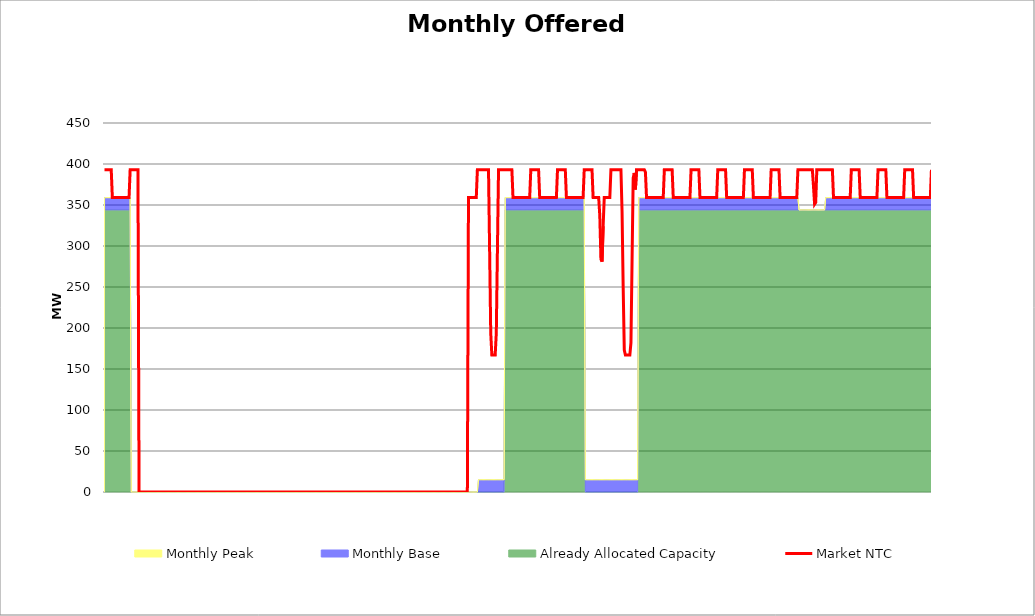
| Category | Market NTC |
|---|---|
| 0 | 393 |
| 1 | 393 |
| 2 | 393 |
| 3 | 393 |
| 4 | 393 |
| 5 | 393 |
| 6 | 393 |
| 7 | 359 |
| 8 | 359 |
| 9 | 359 |
| 10 | 359 |
| 11 | 359 |
| 12 | 359 |
| 13 | 359 |
| 14 | 359 |
| 15 | 359 |
| 16 | 359 |
| 17 | 359 |
| 18 | 359 |
| 19 | 359 |
| 20 | 359 |
| 21 | 359 |
| 22 | 359 |
| 23 | 393 |
| 24 | 393 |
| 25 | 393 |
| 26 | 393 |
| 27 | 393 |
| 28 | 393 |
| 29 | 393 |
| 30 | 393 |
| 31 | 0 |
| 32 | 0 |
| 33 | 0 |
| 34 | 0 |
| 35 | 0 |
| 36 | 0 |
| 37 | 0 |
| 38 | 0 |
| 39 | 0 |
| 40 | 0 |
| 41 | 0 |
| 42 | 0 |
| 43 | 0 |
| 44 | 0 |
| 45 | 0 |
| 46 | 0 |
| 47 | 0 |
| 48 | 0 |
| 49 | 0 |
| 50 | 0 |
| 51 | 0 |
| 52 | 0 |
| 53 | 0 |
| 54 | 0 |
| 55 | 0 |
| 56 | 0 |
| 57 | 0 |
| 58 | 0 |
| 59 | 0 |
| 60 | 0 |
| 61 | 0 |
| 62 | 0 |
| 63 | 0 |
| 64 | 0 |
| 65 | 0 |
| 66 | 0 |
| 67 | 0 |
| 68 | 0 |
| 69 | 0 |
| 70 | 0 |
| 71 | 0 |
| 72 | 0 |
| 73 | 0 |
| 74 | 0 |
| 75 | 0 |
| 76 | 0 |
| 77 | 0 |
| 78 | 0 |
| 79 | 0 |
| 80 | 0 |
| 81 | 0 |
| 82 | 0 |
| 83 | 0 |
| 84 | 0 |
| 85 | 0 |
| 86 | 0 |
| 87 | 0 |
| 88 | 0 |
| 89 | 0 |
| 90 | 0 |
| 91 | 0 |
| 92 | 0 |
| 93 | 0 |
| 94 | 0 |
| 95 | 0 |
| 96 | 0 |
| 97 | 0 |
| 98 | 0 |
| 99 | 0 |
| 100 | 0 |
| 101 | 0 |
| 102 | 0 |
| 103 | 0 |
| 104 | 0 |
| 105 | 0 |
| 106 | 0 |
| 107 | 0 |
| 108 | 0 |
| 109 | 0 |
| 110 | 0 |
| 111 | 0 |
| 112 | 0 |
| 113 | 0 |
| 114 | 0 |
| 115 | 0 |
| 116 | 0 |
| 117 | 0 |
| 118 | 0 |
| 119 | 0 |
| 120 | 0 |
| 121 | 0 |
| 122 | 0 |
| 123 | 0 |
| 124 | 0 |
| 125 | 0 |
| 126 | 0 |
| 127 | 0 |
| 128 | 0 |
| 129 | 0 |
| 130 | 0 |
| 131 | 0 |
| 132 | 0 |
| 133 | 0 |
| 134 | 0 |
| 135 | 0 |
| 136 | 0 |
| 137 | 0 |
| 138 | 0 |
| 139 | 0 |
| 140 | 0 |
| 141 | 0 |
| 142 | 0 |
| 143 | 0 |
| 144 | 0 |
| 145 | 0 |
| 146 | 0 |
| 147 | 0 |
| 148 | 0 |
| 149 | 0 |
| 150 | 0 |
| 151 | 0 |
| 152 | 0 |
| 153 | 0 |
| 154 | 0 |
| 155 | 0 |
| 156 | 0 |
| 157 | 0 |
| 158 | 0 |
| 159 | 0 |
| 160 | 0 |
| 161 | 0 |
| 162 | 0 |
| 163 | 0 |
| 164 | 0 |
| 165 | 0 |
| 166 | 0 |
| 167 | 0 |
| 168 | 0 |
| 169 | 0 |
| 170 | 0 |
| 171 | 0 |
| 172 | 0 |
| 173 | 0 |
| 174 | 0 |
| 175 | 0 |
| 176 | 0 |
| 177 | 0 |
| 178 | 0 |
| 179 | 0 |
| 180 | 0 |
| 181 | 0 |
| 182 | 0 |
| 183 | 0 |
| 184 | 0 |
| 185 | 0 |
| 186 | 0 |
| 187 | 0 |
| 188 | 0 |
| 189 | 0 |
| 190 | 0 |
| 191 | 0 |
| 192 | 0 |
| 193 | 0 |
| 194 | 0 |
| 195 | 0 |
| 196 | 0 |
| 197 | 0 |
| 198 | 0 |
| 199 | 0 |
| 200 | 0 |
| 201 | 0 |
| 202 | 0 |
| 203 | 0 |
| 204 | 0 |
| 205 | 0 |
| 206 | 0 |
| 207 | 0 |
| 208 | 0 |
| 209 | 0 |
| 210 | 0 |
| 211 | 0 |
| 212 | 0 |
| 213 | 0 |
| 214 | 0 |
| 215 | 0 |
| 216 | 0 |
| 217 | 0 |
| 218 | 0 |
| 219 | 0 |
| 220 | 0 |
| 221 | 0 |
| 222 | 0 |
| 223 | 0 |
| 224 | 0 |
| 225 | 0 |
| 226 | 0 |
| 227 | 0 |
| 228 | 0 |
| 229 | 0 |
| 230 | 0 |
| 231 | 0 |
| 232 | 0 |
| 233 | 0 |
| 234 | 0 |
| 235 | 0 |
| 236 | 0 |
| 237 | 0 |
| 238 | 0 |
| 239 | 0 |
| 240 | 0 |
| 241 | 0 |
| 242 | 0 |
| 243 | 0 |
| 244 | 0 |
| 245 | 0 |
| 246 | 0 |
| 247 | 0 |
| 248 | 0 |
| 249 | 0 |
| 250 | 0 |
| 251 | 0 |
| 252 | 0 |
| 253 | 0 |
| 254 | 0 |
| 255 | 0 |
| 256 | 0 |
| 257 | 0 |
| 258 | 0 |
| 259 | 0 |
| 260 | 0 |
| 261 | 0 |
| 262 | 0 |
| 263 | 0 |
| 264 | 0 |
| 265 | 0 |
| 266 | 0 |
| 267 | 0 |
| 268 | 0 |
| 269 | 0 |
| 270 | 0 |
| 271 | 0 |
| 272 | 0 |
| 273 | 0 |
| 274 | 0 |
| 275 | 0 |
| 276 | 0 |
| 277 | 0 |
| 278 | 0 |
| 279 | 0 |
| 280 | 0 |
| 281 | 0 |
| 282 | 0 |
| 283 | 0 |
| 284 | 0 |
| 285 | 0 |
| 286 | 0 |
| 287 | 0 |
| 288 | 0 |
| 289 | 0 |
| 290 | 0 |
| 291 | 0 |
| 292 | 0 |
| 293 | 0 |
| 294 | 0 |
| 295 | 0 |
| 296 | 0 |
| 297 | 0 |
| 298 | 0 |
| 299 | 0 |
| 300 | 0 |
| 301 | 0 |
| 302 | 0 |
| 303 | 0 |
| 304 | 0 |
| 305 | 0 |
| 306 | 0 |
| 307 | 0 |
| 308 | 0 |
| 309 | 0 |
| 310 | 0 |
| 311 | 0 |
| 312 | 0 |
| 313 | 0 |
| 314 | 0 |
| 315 | 0 |
| 316 | 0 |
| 317 | 0 |
| 318 | 0 |
| 319 | 0 |
| 320 | 0 |
| 321 | 0 |
| 322 | 0 |
| 323 | 0 |
| 324 | 0 |
| 325 | 0 |
| 326 | 0 |
| 327 | 359 |
| 328 | 359 |
| 329 | 359 |
| 330 | 359 |
| 331 | 359 |
| 332 | 359 |
| 333 | 359 |
| 334 | 359 |
| 335 | 393 |
| 336 | 393 |
| 337 | 393 |
| 338 | 393 |
| 339 | 393 |
| 340 | 393 |
| 341 | 393 |
| 342 | 393 |
| 343 | 393 |
| 344 | 393 |
| 345 | 393 |
| 346 | 294 |
| 347 | 194 |
| 348 | 167 |
| 349 | 167 |
| 350 | 167 |
| 351 | 167 |
| 352 | 194 |
| 353 | 294 |
| 354 | 393 |
| 355 | 393 |
| 356 | 393 |
| 357 | 393 |
| 358 | 393 |
| 359 | 393 |
| 360 | 393 |
| 361 | 393 |
| 362 | 393 |
| 363 | 393 |
| 364 | 393 |
| 365 | 393 |
| 366 | 393 |
| 367 | 359 |
| 368 | 359 |
| 369 | 359 |
| 370 | 359 |
| 371 | 359 |
| 372 | 359 |
| 373 | 359 |
| 374 | 359 |
| 375 | 359 |
| 376 | 359 |
| 377 | 359 |
| 378 | 359 |
| 379 | 359 |
| 380 | 359 |
| 381 | 359 |
| 382 | 359 |
| 383 | 393 |
| 384 | 393 |
| 385 | 393 |
| 386 | 393 |
| 387 | 393 |
| 388 | 393 |
| 389 | 393 |
| 390 | 393 |
| 391 | 359 |
| 392 | 359 |
| 393 | 359 |
| 394 | 359 |
| 395 | 359 |
| 396 | 359 |
| 397 | 359 |
| 398 | 359 |
| 399 | 359 |
| 400 | 359 |
| 401 | 359 |
| 402 | 359 |
| 403 | 359 |
| 404 | 359 |
| 405 | 359 |
| 406 | 359 |
| 407 | 393 |
| 408 | 393 |
| 409 | 393 |
| 410 | 393 |
| 411 | 393 |
| 412 | 393 |
| 413 | 393 |
| 414 | 393 |
| 415 | 359 |
| 416 | 359 |
| 417 | 359 |
| 418 | 359 |
| 419 | 359 |
| 420 | 359 |
| 421 | 359 |
| 422 | 359 |
| 423 | 359 |
| 424 | 359 |
| 425 | 359 |
| 426 | 359 |
| 427 | 359 |
| 428 | 359 |
| 429 | 359 |
| 430 | 359 |
| 431 | 393 |
| 432 | 393 |
| 433 | 393 |
| 434 | 393 |
| 435 | 393 |
| 436 | 393 |
| 437 | 393 |
| 438 | 393 |
| 439 | 359 |
| 440 | 359 |
| 441 | 359 |
| 442 | 359 |
| 443 | 359 |
| 444 | 359 |
| 445 | 337 |
| 446 | 284 |
| 447 | 281 |
| 448 | 324 |
| 449 | 359 |
| 450 | 359 |
| 451 | 359 |
| 452 | 359 |
| 453 | 359 |
| 454 | 359 |
| 455 | 393 |
| 456 | 393 |
| 457 | 393 |
| 458 | 393 |
| 459 | 393 |
| 460 | 393 |
| 461 | 393 |
| 462 | 393 |
| 463 | 393 |
| 464 | 393 |
| 465 | 342 |
| 466 | 250 |
| 467 | 173 |
| 468 | 167 |
| 469 | 167 |
| 470 | 167 |
| 471 | 167 |
| 472 | 167 |
| 473 | 182 |
| 474 | 283 |
| 475 | 383 |
| 476 | 389 |
| 477 | 369 |
| 478 | 393 |
| 479 | 393 |
| 480 | 393 |
| 481 | 393 |
| 482 | 393 |
| 483 | 393 |
| 484 | 393 |
| 485 | 393 |
| 486 | 390 |
| 487 | 359 |
| 488 | 359 |
| 489 | 359 |
| 490 | 359 |
| 491 | 359 |
| 492 | 359 |
| 493 | 359 |
| 494 | 359 |
| 495 | 359 |
| 496 | 359 |
| 497 | 359 |
| 498 | 359 |
| 499 | 359 |
| 500 | 359 |
| 501 | 359 |
| 502 | 359 |
| 503 | 393 |
| 504 | 393 |
| 505 | 393 |
| 506 | 393 |
| 507 | 393 |
| 508 | 393 |
| 509 | 393 |
| 510 | 393 |
| 511 | 359 |
| 512 | 359 |
| 513 | 359 |
| 514 | 359 |
| 515 | 359 |
| 516 | 359 |
| 517 | 359 |
| 518 | 359 |
| 519 | 359 |
| 520 | 359 |
| 521 | 359 |
| 522 | 359 |
| 523 | 359 |
| 524 | 359 |
| 525 | 359 |
| 526 | 359 |
| 527 | 393 |
| 528 | 393 |
| 529 | 393 |
| 530 | 393 |
| 531 | 393 |
| 532 | 393 |
| 533 | 393 |
| 534 | 393 |
| 535 | 359 |
| 536 | 359 |
| 537 | 359 |
| 538 | 359 |
| 539 | 359 |
| 540 | 359 |
| 541 | 359 |
| 542 | 359 |
| 543 | 359 |
| 544 | 359 |
| 545 | 359 |
| 546 | 359 |
| 547 | 359 |
| 548 | 359 |
| 549 | 359 |
| 550 | 359 |
| 551 | 393 |
| 552 | 393 |
| 553 | 393 |
| 554 | 393 |
| 555 | 393 |
| 556 | 393 |
| 557 | 393 |
| 558 | 393 |
| 559 | 359 |
| 560 | 359 |
| 561 | 359 |
| 562 | 359 |
| 563 | 359 |
| 564 | 359 |
| 565 | 359 |
| 566 | 359 |
| 567 | 359 |
| 568 | 359 |
| 569 | 359 |
| 570 | 359 |
| 571 | 359 |
| 572 | 359 |
| 573 | 359 |
| 574 | 359 |
| 575 | 393 |
| 576 | 393 |
| 577 | 393 |
| 578 | 393 |
| 579 | 393 |
| 580 | 393 |
| 581 | 393 |
| 582 | 393 |
| 583 | 359 |
| 584 | 359 |
| 585 | 359 |
| 586 | 359 |
| 587 | 359 |
| 588 | 359 |
| 589 | 359 |
| 590 | 359 |
| 591 | 359 |
| 592 | 359 |
| 593 | 359 |
| 594 | 359 |
| 595 | 359 |
| 596 | 359 |
| 597 | 359 |
| 598 | 359 |
| 599 | 393 |
| 600 | 393 |
| 601 | 393 |
| 602 | 393 |
| 603 | 393 |
| 604 | 393 |
| 605 | 393 |
| 606 | 393 |
| 607 | 359 |
| 608 | 359 |
| 609 | 359 |
| 610 | 359 |
| 611 | 359 |
| 612 | 359 |
| 613 | 359 |
| 614 | 359 |
| 615 | 359 |
| 616 | 359 |
| 617 | 359 |
| 618 | 359 |
| 619 | 359 |
| 620 | 359 |
| 621 | 359 |
| 622 | 359 |
| 623 | 393 |
| 624 | 393 |
| 625 | 393 |
| 626 | 393 |
| 627 | 393 |
| 628 | 393 |
| 629 | 393 |
| 630 | 393 |
| 631 | 393 |
| 632 | 393 |
| 633 | 393 |
| 634 | 393 |
| 635 | 393 |
| 636 | 393 |
| 637 | 373 |
| 638 | 351 |
| 639 | 353 |
| 640 | 393 |
| 641 | 393 |
| 642 | 393 |
| 643 | 393 |
| 644 | 393 |
| 645 | 393 |
| 646 | 393 |
| 647 | 393 |
| 648 | 393 |
| 649 | 393 |
| 650 | 393 |
| 651 | 393 |
| 652 | 393 |
| 653 | 393 |
| 654 | 393 |
| 655 | 359 |
| 656 | 359 |
| 657 | 359 |
| 658 | 359 |
| 659 | 359 |
| 660 | 359 |
| 661 | 359 |
| 662 | 359 |
| 663 | 359 |
| 664 | 359 |
| 665 | 359 |
| 666 | 359 |
| 667 | 359 |
| 668 | 359 |
| 669 | 359 |
| 670 | 359 |
| 671 | 393 |
| 672 | 393 |
| 673 | 393 |
| 674 | 393 |
| 675 | 393 |
| 676 | 393 |
| 677 | 393 |
| 678 | 393 |
| 679 | 359 |
| 680 | 359 |
| 681 | 359 |
| 682 | 359 |
| 683 | 359 |
| 684 | 359 |
| 685 | 359 |
| 686 | 359 |
| 687 | 359 |
| 688 | 359 |
| 689 | 359 |
| 690 | 359 |
| 691 | 359 |
| 692 | 359 |
| 693 | 359 |
| 694 | 359 |
| 695 | 393 |
| 696 | 393 |
| 697 | 393 |
| 698 | 393 |
| 699 | 393 |
| 700 | 393 |
| 701 | 393 |
| 702 | 393 |
| 703 | 359 |
| 704 | 359 |
| 705 | 359 |
| 706 | 359 |
| 707 | 359 |
| 708 | 359 |
| 709 | 359 |
| 710 | 359 |
| 711 | 359 |
| 712 | 359 |
| 713 | 359 |
| 714 | 359 |
| 715 | 359 |
| 716 | 359 |
| 717 | 359 |
| 718 | 359 |
| 719 | 393 |
| 720 | 393 |
| 721 | 393 |
| 722 | 393 |
| 723 | 393 |
| 724 | 393 |
| 725 | 393 |
| 726 | 393 |
| 727 | 359 |
| 728 | 359 |
| 729 | 359 |
| 730 | 359 |
| 731 | 359 |
| 732 | 359 |
| 733 | 359 |
| 734 | 359 |
| 735 | 359 |
| 736 | 359 |
| 737 | 359 |
| 738 | 359 |
| 739 | 359 |
| 740 | 359 |
| 741 | 359 |
| 742 | 359 |
| 743 | 393 |